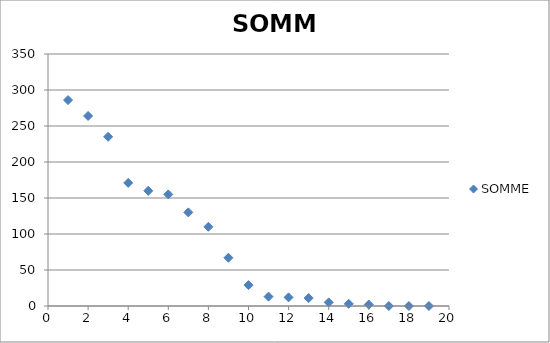
| Category | SOMME |
|---|---|
| 0 | 286 |
| 1 | 264 |
| 2 | 235 |
| 3 | 171 |
| 4 | 160 |
| 5 | 155 |
| 6 | 130 |
| 7 | 110 |
| 8 | 67 |
| 9 | 29 |
| 10 | 13 |
| 11 | 12 |
| 12 | 11 |
| 13 | 5 |
| 14 | 3 |
| 15 | 2 |
| 16 | 0 |
| 17 | 0 |
| 18 | 0 |